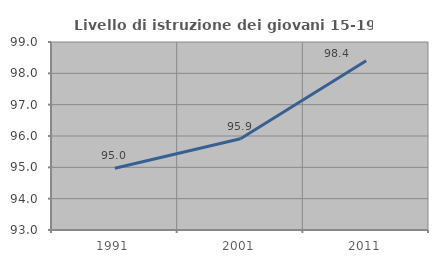
| Category | Livello di istruzione dei giovani 15-19 anni |
|---|---|
| 1991.0 | 94.972 |
| 2001.0 | 95.911 |
| 2011.0 | 98.404 |